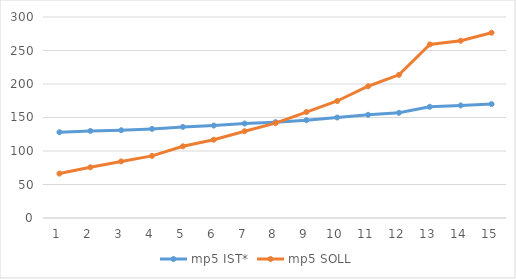
| Category | mp5 IST* | mp5 SOLL |
|---|---|---|
| 0 | 128 | 66.3 |
| 1 | 130 | 75.65 |
| 2 | 131 | 84.45 |
| 3 | 133 | 92.7 |
| 4 | 136 | 107 |
| 5 | 138 | 116.9 |
| 6 | 141 | 129.55 |
| 7 | 143 | 141.65 |
| 8 | 146 | 158.15 |
| 9 | 150 | 174.65 |
| 10 | 154 | 196.65 |
| 11 | 157 | 213.7 |
| 12 | 166 | 259.1 |
| 13 | 168 | 264.5 |
| 14 | 170 | 276.5 |